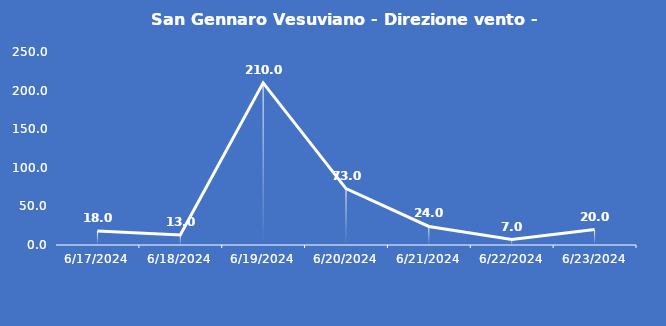
| Category | San Gennaro Vesuviano - Direzione vento - Grezzo (°N) |
|---|---|
| 6/17/24 | 18 |
| 6/18/24 | 13 |
| 6/19/24 | 210 |
| 6/20/24 | 73 |
| 6/21/24 | 24 |
| 6/22/24 | 7 |
| 6/23/24 | 20 |